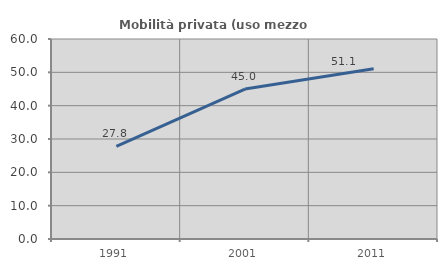
| Category | Mobilità privata (uso mezzo privato) |
|---|---|
| 1991.0 | 27.759 |
| 2001.0 | 44.988 |
| 2011.0 | 51.087 |